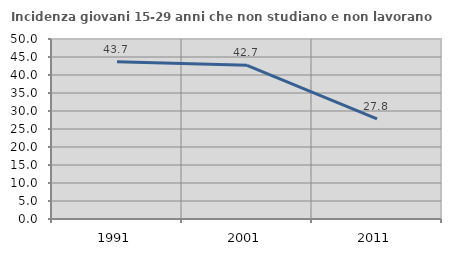
| Category | Incidenza giovani 15-29 anni che non studiano e non lavorano  |
|---|---|
| 1991.0 | 43.665 |
| 2001.0 | 42.705 |
| 2011.0 | 27.803 |